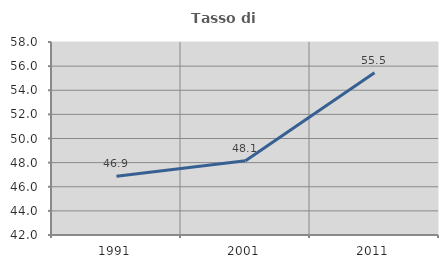
| Category | Tasso di occupazione   |
|---|---|
| 1991.0 | 46.875 |
| 2001.0 | 48.148 |
| 2011.0 | 55.45 |